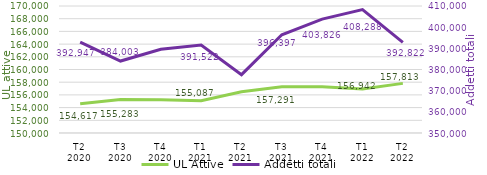
| Category | UL Attive |
|---|---|
| T2
2020 | 154617 |
| T3
2020 | 155283 |
| T4
2020 | 155225 |
| T1
2021 | 155087 |
| T2
2021 | 156494 |
| T3
2021 | 157291 |
| T4
2021 | 157277 |
| T1
2022 | 156942 |
| T2
2022 | 157813 |